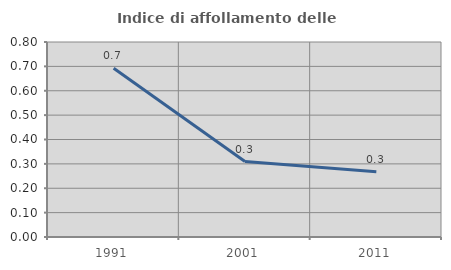
| Category | Indice di affollamento delle abitazioni  |
|---|---|
| 1991.0 | 0.692 |
| 2001.0 | 0.31 |
| 2011.0 | 0.268 |